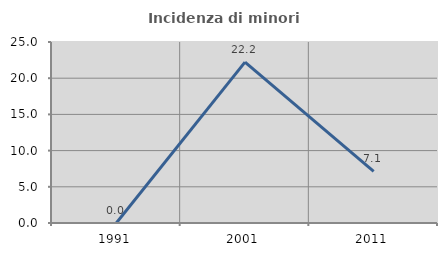
| Category | Incidenza di minori stranieri |
|---|---|
| 1991.0 | 0 |
| 2001.0 | 22.222 |
| 2011.0 | 7.143 |